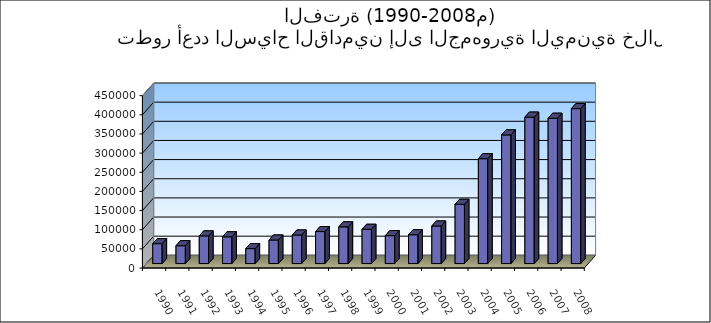
| Category | الاجمالي |
|---|---|
| 1990.0 | 51849 |
| 1991.0 | 46483 |
| 1992.0 | 72169 |
| 1993.0 | 69795 |
| 1994.0 | 38959 |
| 1995.0 | 61451 |
| 1996.0 | 74476 |
| 1997.0 | 83451 |
| 1998.0 | 95762 |
| 1999.0 | 89394 |
| 2000.0 | 72836 |
| 2001.0 | 75146 |
| 2002.0 | 98020 |
| 2003.0 | 154667 |
| 2004.0 | 273732 |
| 2005.0 | 335870 |
| 2006.0 | 382332 |
| 2007.0 | 379390 |
| 2008.0 | 404497 |